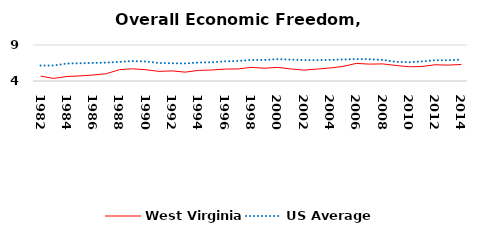
| Category | West Virginia | US Average |
|---|---|---|
| 1982.0 | 4.679 | 6.149 |
| 1983.0 | 4.358 | 6.152 |
| 1984.0 | 4.625 | 6.429 |
| 1985.0 | 4.709 | 6.464 |
| 1986.0 | 4.832 | 6.512 |
| 1987.0 | 5.012 | 6.552 |
| 1988.0 | 5.579 | 6.659 |
| 1989.0 | 5.691 | 6.767 |
| 1990.0 | 5.566 | 6.71 |
| 1991.0 | 5.337 | 6.502 |
| 1992.0 | 5.402 | 6.463 |
| 1993.0 | 5.229 | 6.446 |
| 1994.0 | 5.476 | 6.563 |
| 1995.0 | 5.526 | 6.593 |
| 1996.0 | 5.652 | 6.73 |
| 1997.0 | 5.678 | 6.781 |
| 1998.0 | 5.888 | 6.926 |
| 1999.0 | 5.778 | 6.925 |
| 2000.0 | 5.892 | 7.031 |
| 2001.0 | 5.678 | 6.969 |
| 2002.0 | 5.513 | 6.912 |
| 2003.0 | 5.65 | 6.892 |
| 2004.0 | 5.806 | 6.934 |
| 2005.0 | 6.02 | 6.99 |
| 2006.0 | 6.443 | 7.048 |
| 2007.0 | 6.344 | 7.028 |
| 2008.0 | 6.378 | 6.935 |
| 2009.0 | 6.167 | 6.668 |
| 2010.0 | 5.975 | 6.605 |
| 2011.0 | 6.012 | 6.72 |
| 2012.0 | 6.259 | 6.883 |
| 2013.0 | 6.205 | 6.881 |
| 2014.0 | 6.3 | 6.973 |